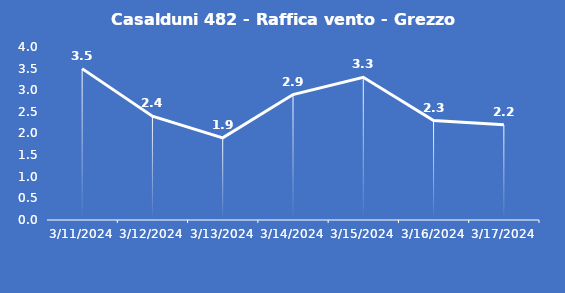
| Category | Casalduni 482 - Raffica vento - Grezzo (m/s) |
|---|---|
| 3/11/24 | 3.5 |
| 3/12/24 | 2.4 |
| 3/13/24 | 1.9 |
| 3/14/24 | 2.9 |
| 3/15/24 | 3.3 |
| 3/16/24 | 2.3 |
| 3/17/24 | 2.2 |